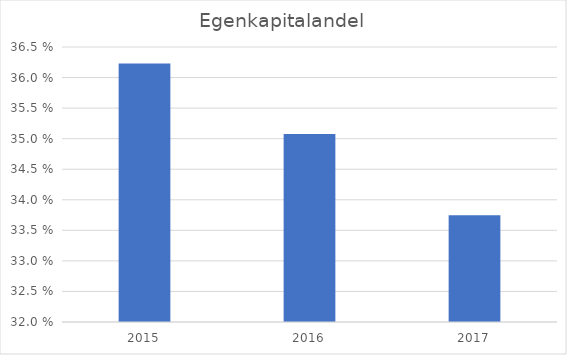
| Category | Egenkapital andel |
|---|---|
| 2015.0 | 0.362 |
| 2016.0 | 0.351 |
| 2017.0 | 0.337 |